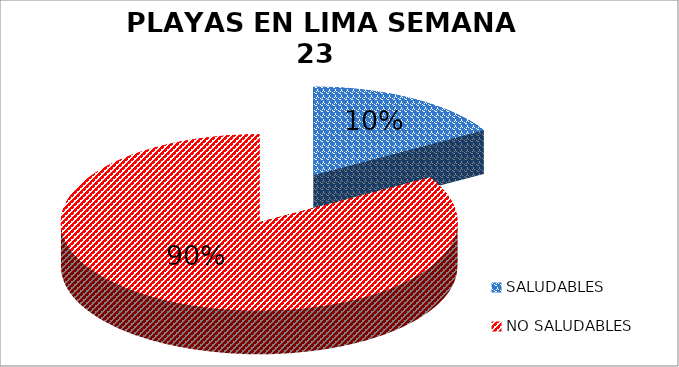
| Category | N.° |
|---|---|
| SALUDABLES | 13 |
| NO SALUDABLES | 66 |